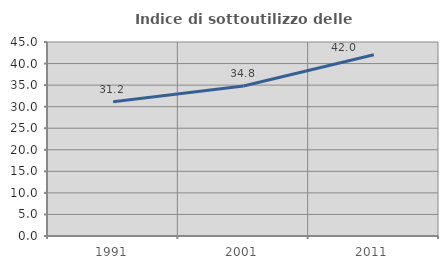
| Category | Indice di sottoutilizzo delle abitazioni  |
|---|---|
| 1991.0 | 31.152 |
| 2001.0 | 34.799 |
| 2011.0 | 42.037 |